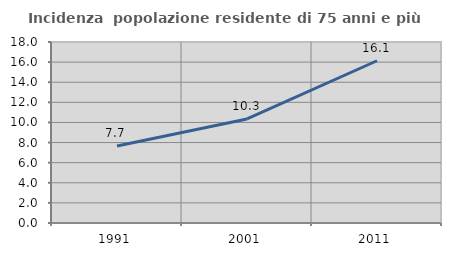
| Category | Incidenza  popolazione residente di 75 anni e più |
|---|---|
| 1991.0 | 7.659 |
| 2001.0 | 10.345 |
| 2011.0 | 16.135 |